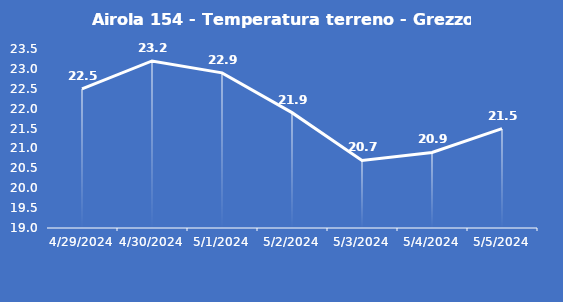
| Category | Airola 154 - Temperatura terreno - Grezzo (°C) |
|---|---|
| 4/29/24 | 22.5 |
| 4/30/24 | 23.2 |
| 5/1/24 | 22.9 |
| 5/2/24 | 21.9 |
| 5/3/24 | 20.7 |
| 5/4/24 | 20.9 |
| 5/5/24 | 21.5 |